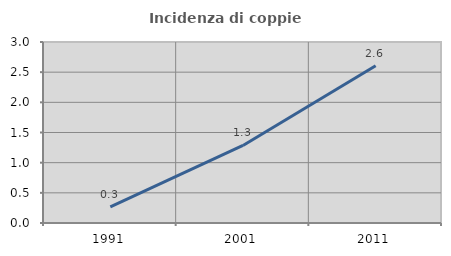
| Category | Incidenza di coppie miste |
|---|---|
| 1991.0 | 0.267 |
| 2001.0 | 1.285 |
| 2011.0 | 2.607 |